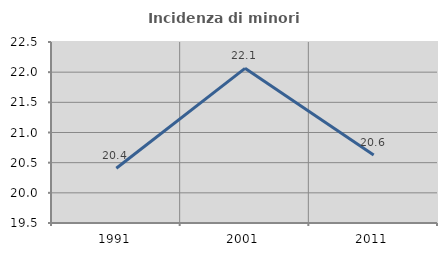
| Category | Incidenza di minori stranieri |
|---|---|
| 1991.0 | 20.408 |
| 2001.0 | 22.063 |
| 2011.0 | 20.628 |